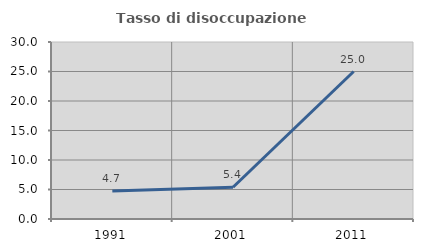
| Category | Tasso di disoccupazione giovanile  |
|---|---|
| 1991.0 | 4.73 |
| 2001.0 | 5.385 |
| 2011.0 | 25 |